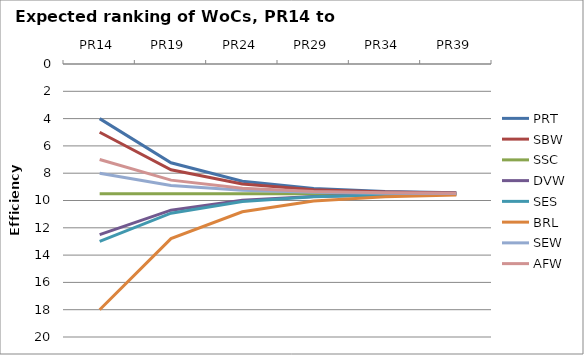
| Category | PRT | SBW | SSC | DVW | SES | BRL | SEW | AFW |
|---|---|---|---|---|---|---|---|---|
| PR14 | 4 | 5 | 9.5 | 12.5 | 13 | 18 | 8 | 7 |
| PR19 | 7.234 | 7.746 | 9.5 | 10.71 | 10.928 | 12.79 | 8.901 | 8.508 |
| PR24 | 8.582 | 8.791 | 9.5 | 9.989 | 10.078 | 10.829 | 9.258 | 9.099 |
| PR29 | 9.129 | 9.213 | 9.5 | 9.698 | 9.734 | 10.038 | 9.402 | 9.338 |
| PR34 | 9.35 | 9.384 | 9.5 | 9.58 | 9.595 | 9.718 | 9.46 | 9.434 |
| PR39 | 9.439 | 9.453 | 9.5 | 9.532 | 9.538 | 9.588 | 9.484 | 9.473 |